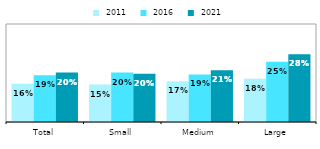
| Category |  2011 |  2016 |  2021 |
|---|---|---|---|
| Total | 0.156 | 0.191 | 0.202 |
| Small | 0.153 | 0.202 | 0.197 |
| Medium | 0.166 | 0.194 | 0.211 |
| Large | 0.177 | 0.246 | 0.277 |